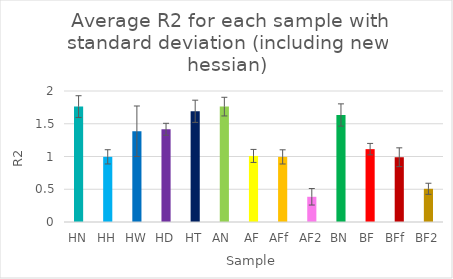
| Category | Average R2 |
|---|---|
| HN | 1.762 |
| HH | 0.995 |
| HW | 1.386 |
| HD | 1.416 |
| HT | 1.69 |
| AN  | 1.762 |
| AF | 1.009 |
| AFf  | 0.994 |
| AF2 | 0.385 |
| BN | 1.634 |
| BF  | 1.112 |
| BFf  | 0.989 |
| BF2 | 0.507 |